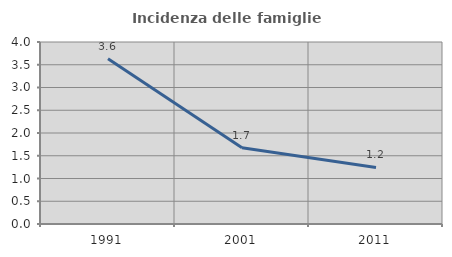
| Category | Incidenza delle famiglie numerose |
|---|---|
| 1991.0 | 3.632 |
| 2001.0 | 1.674 |
| 2011.0 | 1.243 |